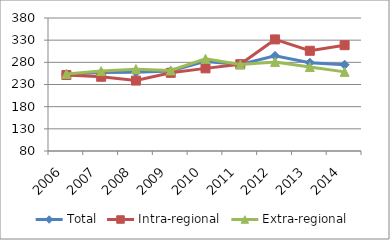
| Category | Total | Intra-regional | Extra-regional |
|---|---|---|---|
| 2006.0 | 253.209 | 251.38 | 253.881 |
| 2007.0 | 256.788 | 247.425 | 260.227 |
| 2008.0 | 257.73 | 238.851 | 264.664 |
| 2009.0 | 260.308 | 256.338 | 261.766 |
| 2010.0 | 282.102 | 266.397 | 287.871 |
| 2011.0 | 275.156 | 275.821 | 274.912 |
| 2012.0 | 294.569 | 331.693 | 280.932 |
| 2013.0 | 279.204 | 306.039 | 269.346 |
| 2014.0 | 274.649 | 318.686 | 258.473 |